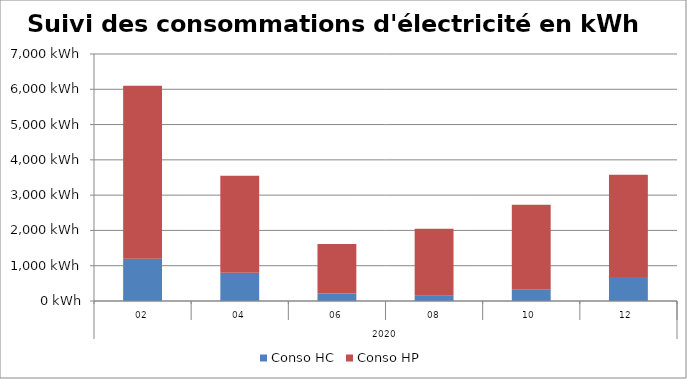
| Category | Conso HC | Conso HP |
|---|---|---|
| 0 | 1200 | 4900 |
| 1 | 800 | 2750 |
| 2 | 215 | 1400 |
| 3 | 150 | 1900 |
| 4 | 330 | 2400 |
| 5 | 680 | 2900 |